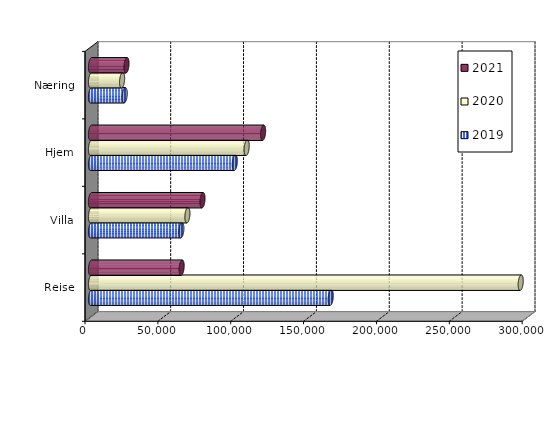
| Category | 2019 | 2020 | 2021 |
|---|---|---|---|
| Reise | 164509.615 | 294870 | 62196 |
| Villa | 62005.237 | 66159.206 | 76519.525 |
| Hjem | 98699.425 | 106839.92 | 118109 |
| Næring | 23125.532 | 21334.431 | 24373.17 |